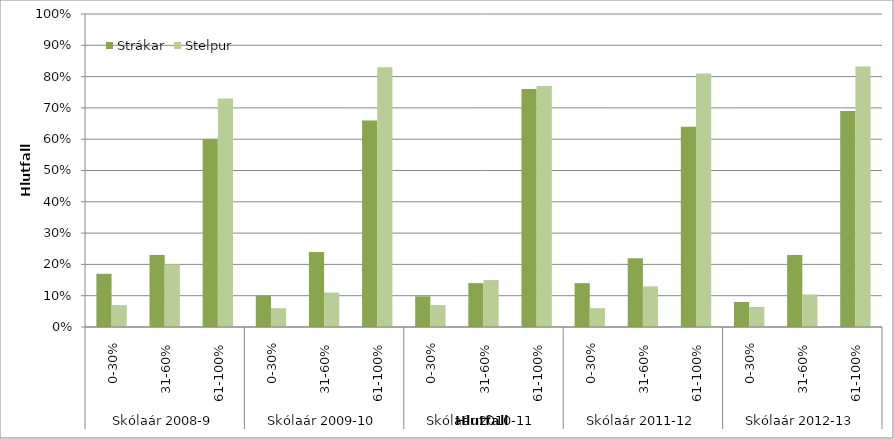
| Category | Strákar | Stelpur |
|---|---|---|
| 0 | 0.17 | 0.07 |
| 1 | 0.23 | 0.2 |
| 2 | 0.6 | 0.73 |
| 3 | 0.1 | 0.06 |
| 4 | 0.24 | 0.11 |
| 5 | 0.66 | 0.83 |
| 6 | 0.098 | 0.07 |
| 7 | 0.14 | 0.15 |
| 8 | 0.76 | 0.77 |
| 9 | 0.14 | 0.06 |
| 10 | 0.22 | 0.13 |
| 11 | 0.64 | 0.81 |
| 12 | 0.08 | 0.064 |
| 13 | 0.23 | 0.104 |
| 14 | 0.69 | 0.832 |